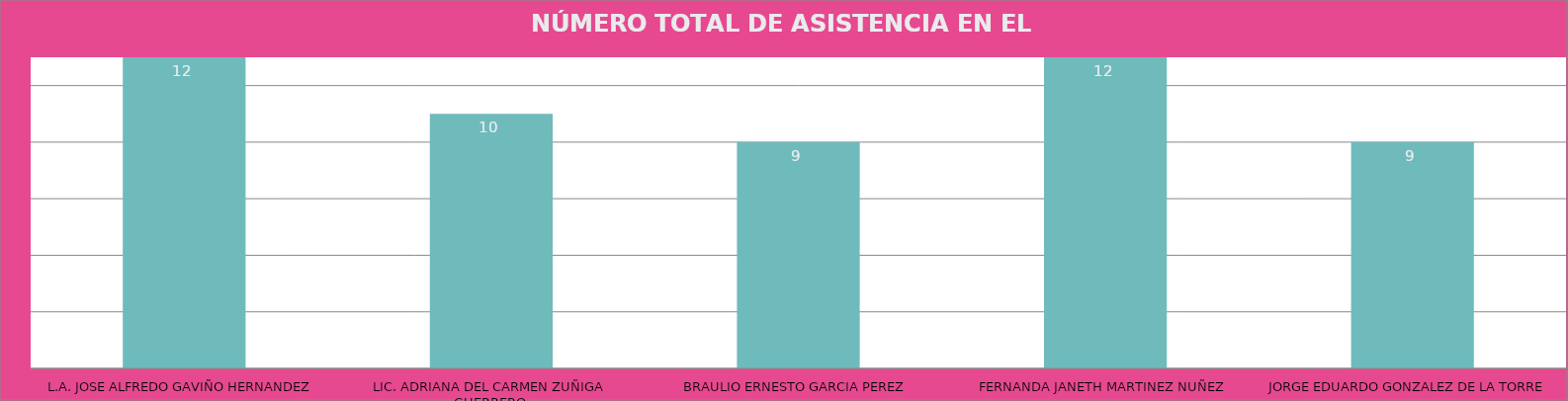
| Category | L.A. JOSE ALFREDO GAVIÑO HERNANDEZ |
|---|---|
| L.A. JOSE ALFREDO GAVIÑO HERNANDEZ | 12 |
| LIC. ADRIANA DEL CARMEN ZUÑIGA GUERRERO | 10 |
| BRAULIO ERNESTO GARCIA PEREZ | 9 |
| FERNANDA JANETH MARTINEZ NUÑEZ | 12 |
| JORGE EDUARDO GONZALEZ DE LA TORRE | 9 |